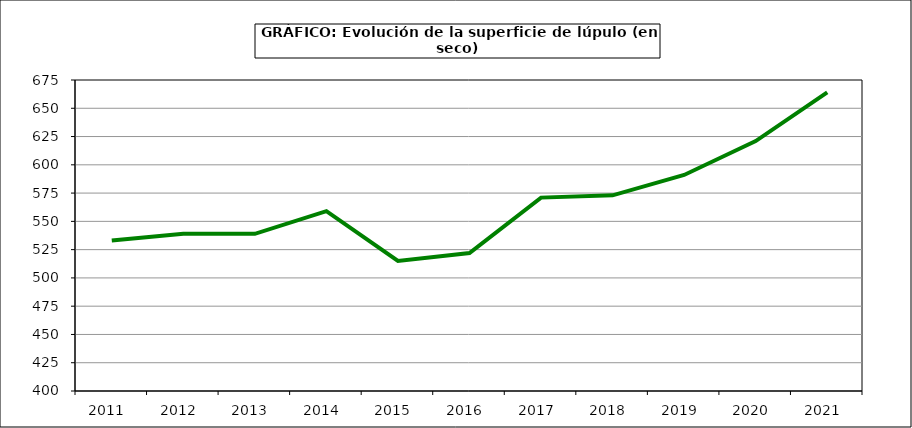
| Category | Superficie |
|---|---|
| 2011.0 | 533 |
| 2012.0 | 539 |
| 2013.0 | 539 |
| 2014.0 | 559 |
| 2015.0 | 515 |
| 2016.0 | 522 |
| 2017.0 | 571 |
| 2018.0 | 573 |
| 2019.0 | 591 |
| 2020.0 | 621 |
| 2021.0 | 664 |